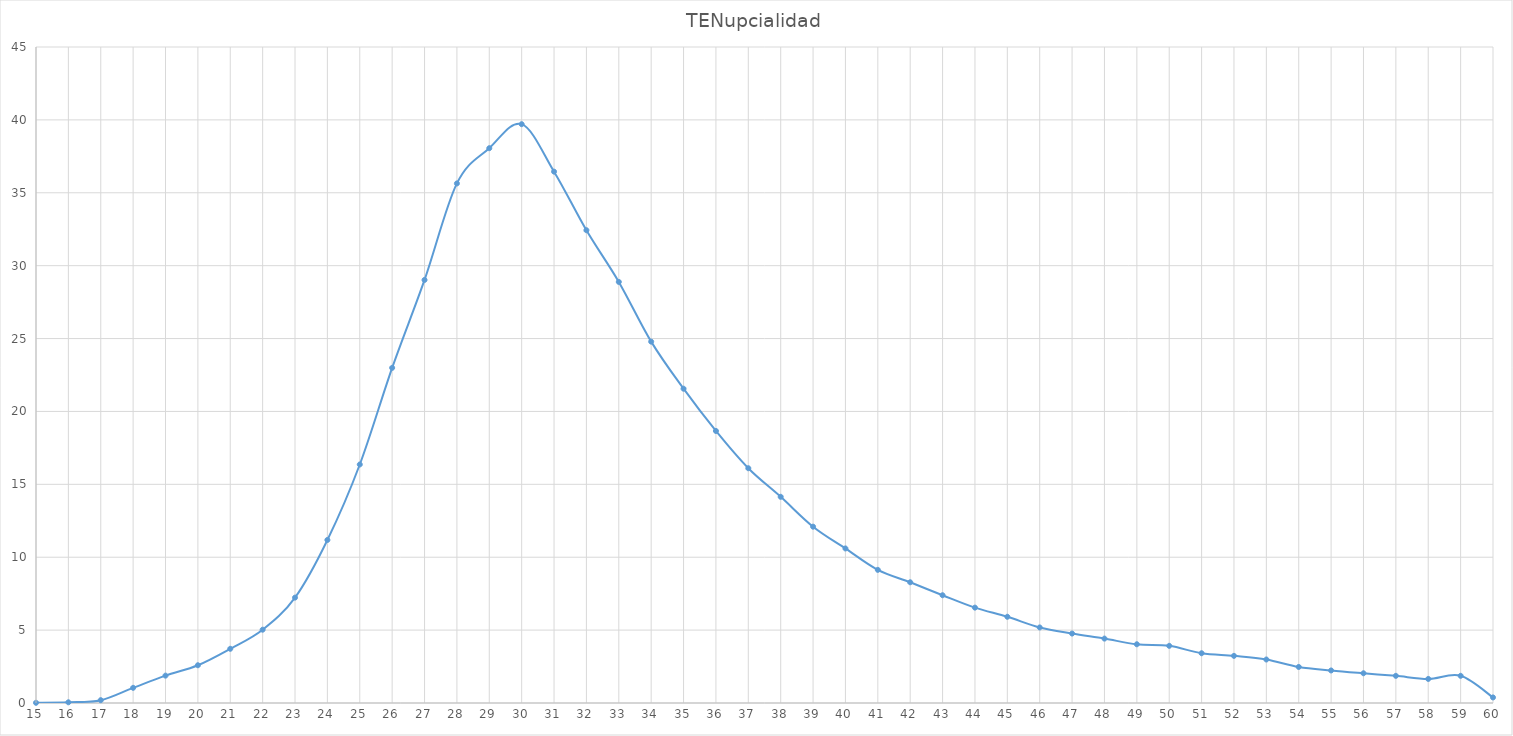
| Category | TENupcialidad |
|---|---|
| 15.0 | 0.014 |
| 16.0 | 0.048 |
| 17.0 | 0.193 |
| 18.0 | 1.041 |
| 19.0 | 1.878 |
| 20.0 | 2.591 |
| 21.0 | 3.719 |
| 22.0 | 5.029 |
| 23.0 | 7.229 |
| 24.0 | 11.184 |
| 25.0 | 16.361 |
| 26.0 | 22.99 |
| 27.0 | 29.021 |
| 28.0 | 35.641 |
| 29.0 | 38.058 |
| 30.0 | 39.705 |
| 31.0 | 36.449 |
| 32.0 | 32.431 |
| 33.0 | 28.886 |
| 34.0 | 24.789 |
| 35.0 | 21.559 |
| 36.0 | 18.66 |
| 37.0 | 16.105 |
| 38.0 | 14.145 |
| 39.0 | 12.095 |
| 40.0 | 10.601 |
| 41.0 | 9.133 |
| 42.0 | 8.282 |
| 43.0 | 7.393 |
| 44.0 | 6.542 |
| 45.0 | 5.915 |
| 46.0 | 5.182 |
| 47.0 | 4.764 |
| 48.0 | 4.418 |
| 49.0 | 4.029 |
| 50.0 | 3.922 |
| 51.0 | 3.413 |
| 52.0 | 3.233 |
| 53.0 | 2.984 |
| 54.0 | 2.473 |
| 55.0 | 2.232 |
| 56.0 | 2.04 |
| 57.0 | 1.863 |
| 58.0 | 1.652 |
| 59.0 | 1.865 |
| 60.0 | 0.381 |